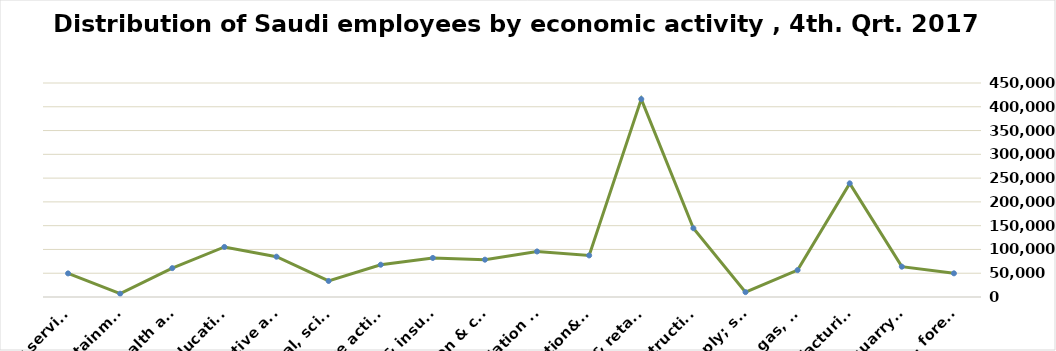
| Category | Series 0 |
|---|---|
| Agriculture, forestry & fishing | 49781 |
| Mining & quarrying | 63792 |
| Manufacturing | 238952 |
| Electricity, gas, steam & air conditioning supply | 56521 |
| Water supply; sewerage, waste remediation  | 10296 |
| Construction | 144569 |
| Wholesale& retail trade; repair of motor vehicles | 416117 |
| Transportation& storage | 87402 |
| Accommodation & food service activities | 95765 |
| Information & communication | 78491 |
| Financial & insurance | 82121 |
| Real estate activities | 67887 |
| Professional, scientific & technical activities | 33696 |
| Administrative and support service activities | 84742 |
| Education | 105209 |
| Human health and &l work activities | 60700 |
| Arts, entertainment & recreation | 6899 |
| Other service | 49618 |